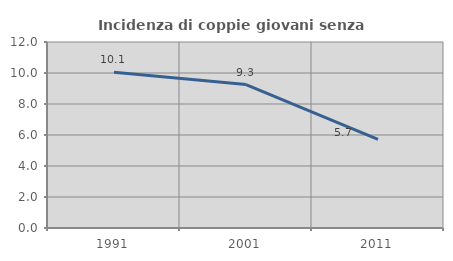
| Category | Incidenza di coppie giovani senza figli |
|---|---|
| 1991.0 | 10.05 |
| 2001.0 | 9.257 |
| 2011.0 | 5.719 |